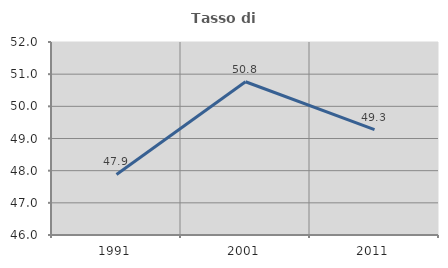
| Category | Tasso di occupazione   |
|---|---|
| 1991.0 | 47.882 |
| 2001.0 | 50.764 |
| 2011.0 | 49.274 |